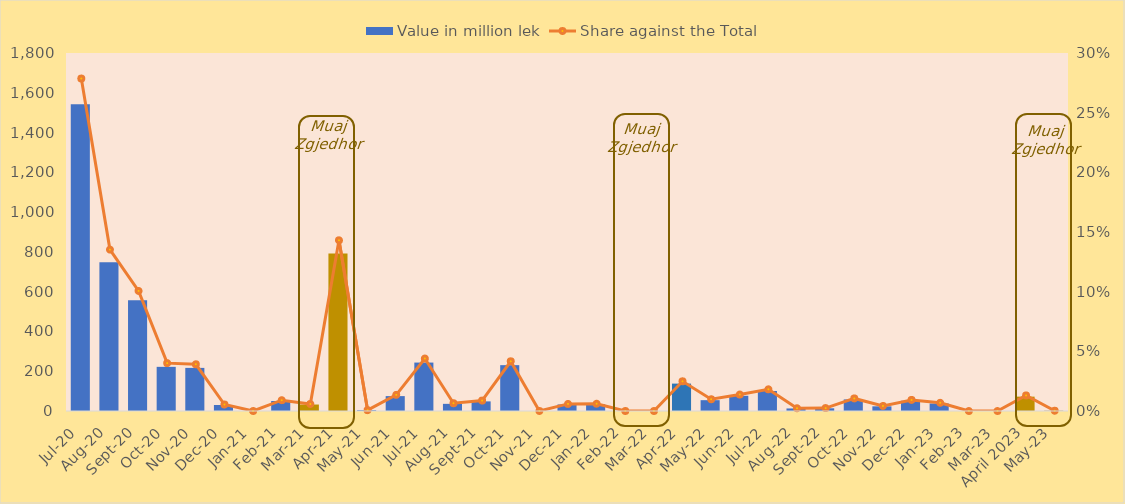
| Category | Value in million lek |
|---|---|
| Jul-20 | 1541.8 |
| Aug-20 | 748.45 |
| Sep-20 | 556.75 |
| Oct-20 | 222.017 |
| Nov-20 | 216.75 |
| Dec-20 | 30.1 |
| Jan-21 | 0 |
| Feb-21 | 50.15 |
| Mar-21 | 32.5 |
| Apr-21 | 791.633 |
| May-21 | 3.878 |
| Jun-21 | 74.9 |
| Jul-21 | 243.515 |
| Aug-21 | 35.97 |
| Sep-21 | 48.385 |
| Oct-21 | 230.5 |
| Nov-21 | 0 |
| Dec-21 | 32.9 |
| Jan-22 | 33.901 |
| Feb-22 | 0 |
| Mar-22 | 0 |
| Apr-22 | 137.712 |
| May-22 | 54.452 |
| Jun-22 | 76.49 |
| Jul-22 | 100.685 |
| Aug-22 | 12.759 |
| Sep-22 | 13.568 |
| Oct-22 | 58.274 |
| Nov-22 | 23.424 |
| Dec-22 | 51.322 |
| Jan-23 | 38.014 |
| Feb-23 | 0 |
| Mar-23 | 0 |
| April 2023 | 72.188 |
| May-23 | 1.147 |